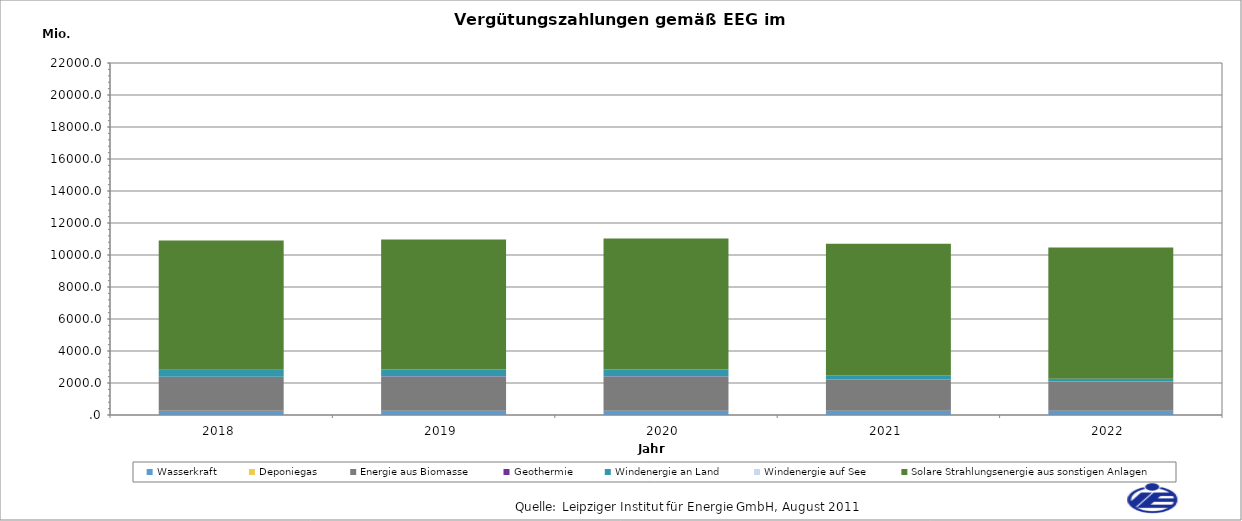
| Category | Wasserkraft | Deponiegas | Energie aus Biomasse | Geothermie | Windenergie an Land | Windenergie auf See | Solare Strahlungsenergie aus sonstigen Anlagen |
|---|---|---|---|---|---|---|---|
| 2018.0 | 257.609 | 9.477 | 2121.331 | 6.496 | 435.251 | 0 | 8071.243 |
| 2019.0 | 258.409 | 8.633 | 2144.745 | 6.496 | 427.779 | 0 | 8122.33 |
| 2020.0 | 260.051 | 7.884 | 2142.126 | 6.511 | 421.049 | 0 | 8189.896 |
| 2021.0 | 259.979 | 2.634 | 1947.174 | 6.496 | 269.327 | 0 | 8216.37 |
| 2022.0 | 260.75 | 1.424 | 1826.659 | 6.496 | 170.781 | 0 | 8196.916 |